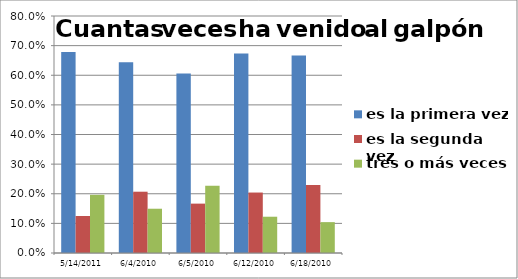
| Category | es la primera vez | es la segunda vez | tres o más veces |
|---|---|---|---|
| 14/05/2011 | 0.679 | 0.125 | 0.196 |
| 04/06/2010 | 0.644 | 0.207 | 0.149 |
| 05/06/2010 | 0.606 | 0.167 | 0.227 |
| 12/06/2010 | 0.673 | 0.204 | 0.122 |
| 18/06/2010 | 0.667 | 0.229 | 0.104 |